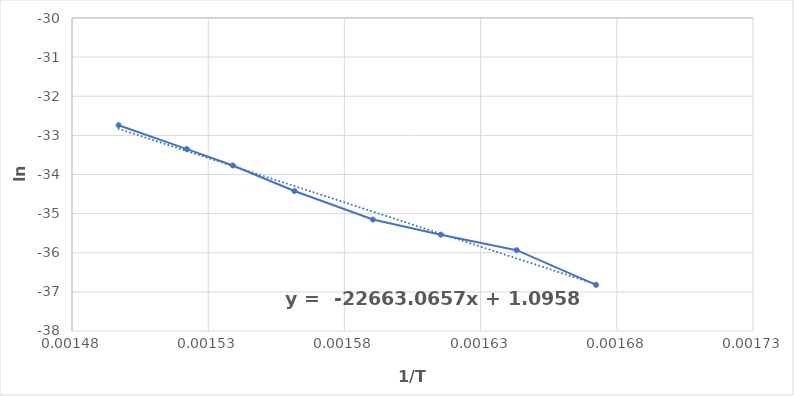
| Category | ln (k/C'T) |
|---|---|
| 0.0016723806338322601 | -36.822 |
| 0.0016432503491906993 | -35.934 |
| 0.0016153784023907602 | -35.537 |
| 0.0015904572564612327 | -35.151 |
| 0.0015616459748575 | -34.421 |
| 0.0015390534821085034 | -33.77 |
| 0.0015221858588933708 | -33.353 |
| 0.0014971180477580657 | -32.74 |